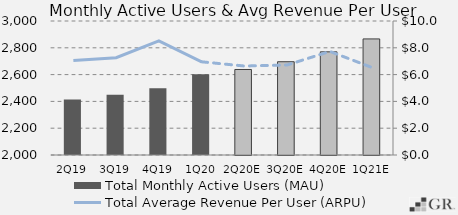
| Category | Total Monthly Active Users (MAU)  |
|---|---|
|  2Q19  | 2414 |
|  3Q19  | 2449 |
|  4Q19  | 2497.8 |
|  1Q20  | 2603 |
|  2Q20E  | 2638.195 |
|  3Q20E  | 2696.11 |
|  4Q20E  | 2769.878 |
|  1Q21E  | 2866.269 |